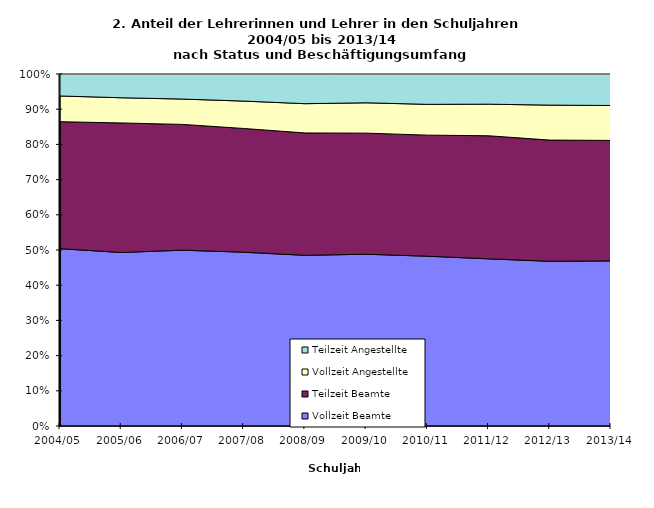
| Category | Vollzeit Beamte | Teilzeit Beamte | Vollzeit Angestellte | Teilzeit Angestellte |
|---|---|---|---|---|
| 2004/05 | 11385 | 8155 | 1652 | 1411 |
| 2005/06 | 11338 | 8467 | 1647 | 1552 |
| 2006/07 | 11459 | 8197 | 1652 | 1633 |
| 2007/08 | 11259 | 8019 | 1774 | 1755 |
| 2008/09 | 11040 | 7916 | 1893 | 1920 |
| 2009/10 | 11369 | 8015 | 2007 | 1907 |
| 2010/11 | 11357 | 8100 | 2060 | 2029 |
| 2011/12 | 11140 | 8206 | 2104 | 2012 |
| 2012/13 | 10889 | 8012 | 2312 | 2057 |
| 2013/14 | 10885 | 7947 | 2302 | 2077 |